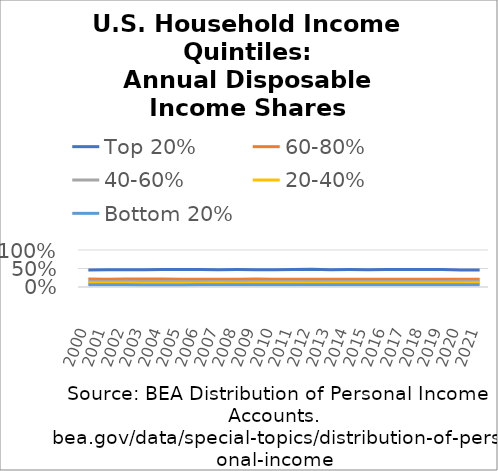
| Category | Top 20% | 60-80% | 40-60% | 20-40% | Bottom 20% |
|---|---|---|---|---|---|
| 2000.0 | 0.462 | 0.214 | 0.153 | 0.106 | 0.059 |
| 2001.0 | 0.465 | 0.213 | 0.152 | 0.106 | 0.059 |
| 2002.0 | 0.467 | 0.214 | 0.152 | 0.105 | 0.058 |
| 2003.0 | 0.467 | 0.217 | 0.151 | 0.104 | 0.056 |
| 2004.0 | 0.473 | 0.214 | 0.149 | 0.104 | 0.057 |
| 2005.0 | 0.473 | 0.212 | 0.15 | 0.104 | 0.056 |
| 2006.0 | 0.475 | 0.209 | 0.147 | 0.104 | 0.059 |
| 2007.0 | 0.469 | 0.211 | 0.149 | 0.105 | 0.059 |
| 2008.0 | 0.472 | 0.212 | 0.15 | 0.104 | 0.059 |
| 2009.0 | 0.467 | 0.213 | 0.149 | 0.107 | 0.06 |
| 2010.0 | 0.463 | 0.213 | 0.152 | 0.108 | 0.06 |
| 2011.0 | 0.473 | 0.21 | 0.148 | 0.105 | 0.059 |
| 2012.0 | 0.478 | 0.208 | 0.146 | 0.104 | 0.059 |
| 2013.0 | 0.469 | 0.211 | 0.15 | 0.106 | 0.059 |
| 2014.0 | 0.474 | 0.211 | 0.148 | 0.105 | 0.058 |
| 2015.0 | 0.469 | 0.211 | 0.149 | 0.106 | 0.06 |
| 2016.0 | 0.47 | 0.21 | 0.148 | 0.107 | 0.061 |
| 2017.0 | 0.473 | 0.209 | 0.148 | 0.105 | 0.06 |
| 2018.0 | 0.473 | 0.209 | 0.148 | 0.106 | 0.06 |
| 2019.0 | 0.47 | 0.211 | 0.15 | 0.106 | 0.059 |
| 2020.0 | 0.462 | 0.21 | 0.153 | 0.11 | 0.061 |
| 2021.0 | 0.458 | 0.209 | 0.154 | 0.112 | 0.063 |